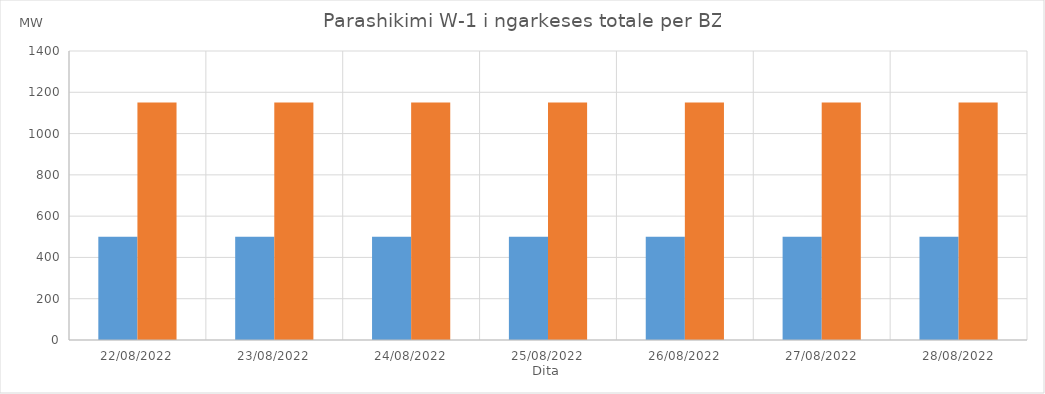
| Category | Min (MW) | Max (MW) |
|---|---|---|
| 22/08/2022 | 500 | 1150 |
| 23/08/2022 | 500 | 1150 |
| 24/08/2022 | 500 | 1150 |
| 25/08/2022 | 500 | 1150 |
| 26/08/2022 | 500 | 1150 |
| 27/08/2022 | 500 | 1150 |
| 28/08/2022 | 500 | 1150 |